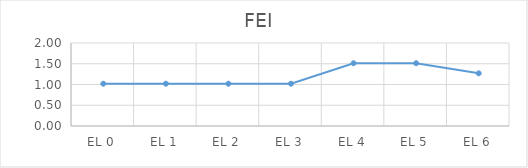
| Category | FEI  |
|---|---|
| EL 0 | 1.019 |
| EL 1 | 1.019 |
| EL 2 | 1.019 |
| EL 3 | 1.019 |
| EL 4 | 1.513 |
| EL 5 | 1.513 |
| EL 6 | 1.269 |